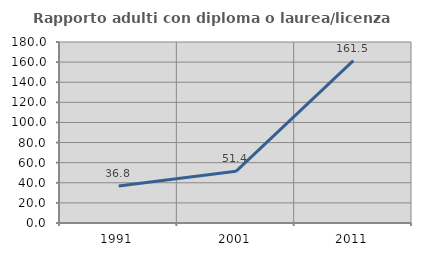
| Category | Rapporto adulti con diploma o laurea/licenza media  |
|---|---|
| 1991.0 | 36.791 |
| 2001.0 | 51.377 |
| 2011.0 | 161.538 |